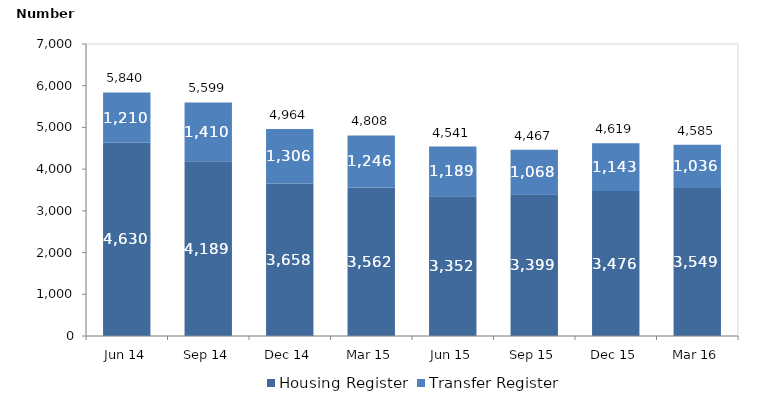
| Category | Housing Register | Transfer Register |
|---|---|---|
| Jun 14 | 4630 | 1210 |
| Sep 14 | 4189 | 1410 |
| Dec 14 | 3658 | 1306 |
| Mar 15 | 3562 | 1246 |
| Jun 15 | 3352 | 1189 |
| Sep 15 | 3399 | 1068 |
| Dec 15 | 3476 | 1143 |
| Mar 16 | 3549 | 1036 |